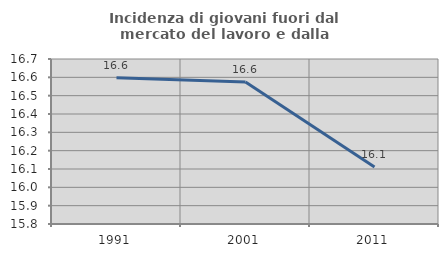
| Category | Incidenza di giovani fuori dal mercato del lavoro e dalla formazione  |
|---|---|
| 1991.0 | 16.598 |
| 2001.0 | 16.575 |
| 2011.0 | 16.111 |